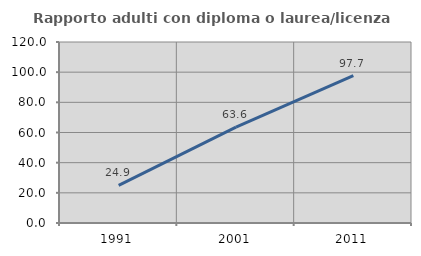
| Category | Rapporto adulti con diploma o laurea/licenza media  |
|---|---|
| 1991.0 | 24.941 |
| 2001.0 | 63.601 |
| 2011.0 | 97.736 |